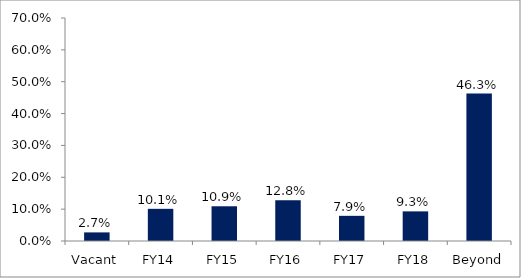
| Category | Series 0 |
|---|---|
| Vacant | 0.027 |
| FY14 | 0.101 |
| FY15 | 0.109 |
| FY16 | 0.128 |
| FY17 | 0.079 |
| FY18 | 0.093 |
| Beyond | 0.463 |